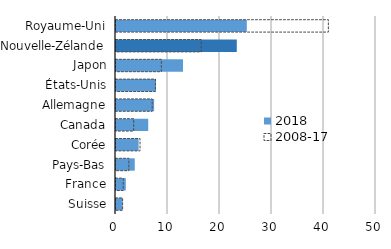
| Category | 2018 | 2008-17 |
|---|---|---|
| Royaume-Uni | 25.157 | 40.841 |
| Nouvelle-Zélande | 23.229 | 16.376 |
| Japon | 12.888 | 8.715 |
| États-Unis | 7.676 | 7.581 |
| Allemagne | 7.331 | 6.96 |
| Canada | 6.199 | 3.41 |
| Corée | 4.349 | 4.62 |
| Pays-Bas | 3.608 | 2.475 |
| France | 1.884 | 1.394 |
| Suisse | 1.246 | 1.273 |